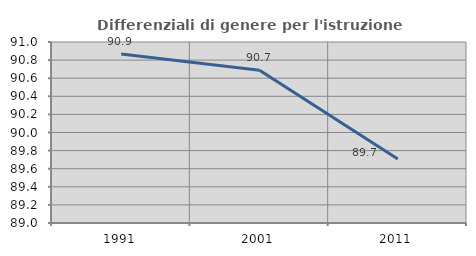
| Category | Differenziali di genere per l'istruzione superiore |
|---|---|
| 1991.0 | 90.869 |
| 2001.0 | 90.688 |
| 2011.0 | 89.707 |